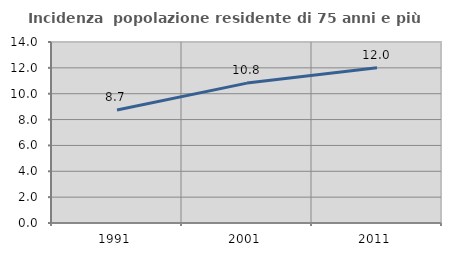
| Category | Incidenza  popolazione residente di 75 anni e più |
|---|---|
| 1991.0 | 8.745 |
| 2001.0 | 10.82 |
| 2011.0 | 12.001 |